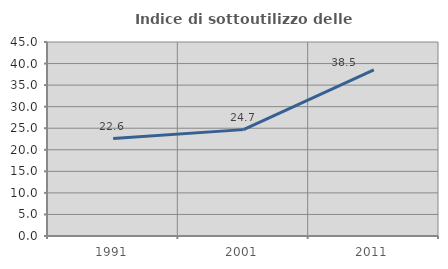
| Category | Indice di sottoutilizzo delle abitazioni  |
|---|---|
| 1991.0 | 22.59 |
| 2001.0 | 24.675 |
| 2011.0 | 38.516 |